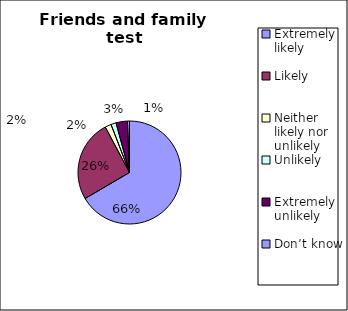
| Category | Series 0 |
|---|---|
| Extremely likely  | 205 |
| Likely  | 79 |
| Neither likely nor unlikely | 6 |
| Unlikely  | 5 |
| Extremely unlikely  | 11 |
| Don’t know  | 2 |